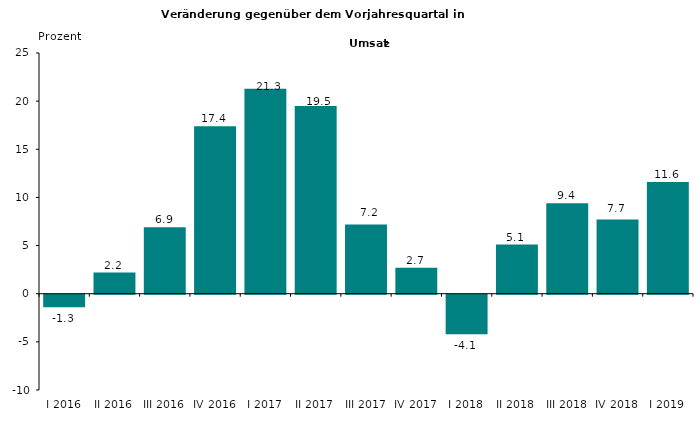
| Category | -1,3 2,2 6,9 17,4 21,3 19,5 7,2 2,7 -4,1 5,1 9,4 7,7 11,6 |
|---|---|
| I 2016 | -1.3 |
| II 2016 | 2.2 |
| III 2016 | 6.9 |
| IV 2016 | 17.4 |
| I 2017 | 21.3 |
| II 2017 | 19.5 |
| III 2017 | 7.2 |
| IV 2017 | 2.7 |
| I 2018 | -4.1 |
| II 2018 | 5.1 |
| III 2018 | 9.4 |
| IV 2018 | 7.7 |
| I 2019 | 11.6 |